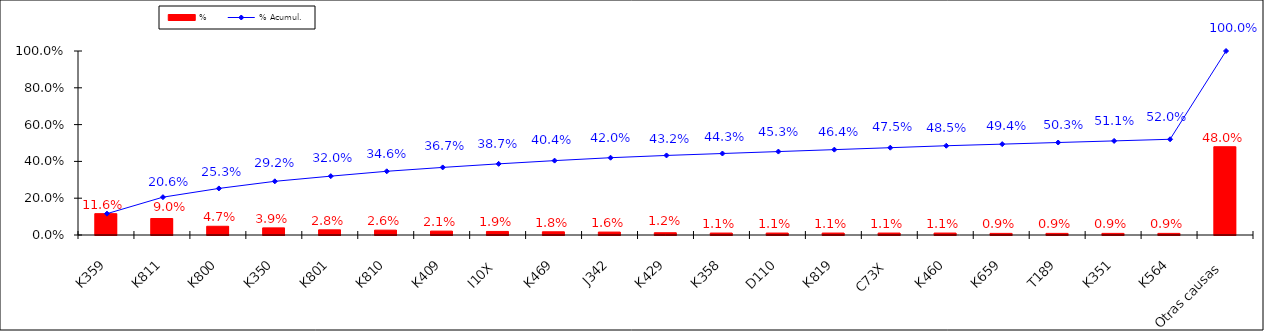
| Category | % |
|---|---|
| K359 | 0.116 |
| K811 | 0.09 |
| K800 | 0.047 |
| K350 | 0.039 |
| K801 | 0.028 |
| K810 | 0.026 |
| K409 | 0.021 |
| I10X | 0.019 |
| K469 | 0.018 |
| J342 | 0.016 |
| K429 | 0.012 |
| K358 | 0.011 |
| D110 | 0.011 |
| K819 | 0.011 |
| C73X | 0.011 |
| K460 | 0.011 |
| K659 | 0.009 |
| T189 | 0.009 |
| K351 | 0.009 |
| K564 | 0.009 |
| Otras causas | 0.48 |